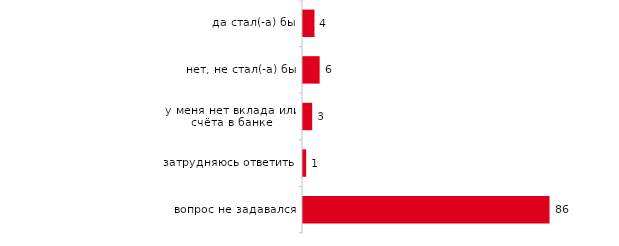
| Category | Series 0 |
|---|---|
| да стал(-а) бы | 4 |
| нет, не стал(-а) бы | 5.8 |
| у меня нет вклада или счёта в банке | 3.2 |
| затрудняюсь ответить | 1.1 |
| вопрос не задавался | 85.9 |